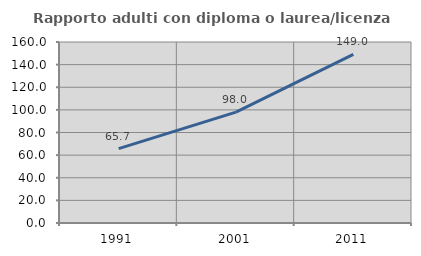
| Category | Rapporto adulti con diploma o laurea/licenza media  |
|---|---|
| 1991.0 | 65.743 |
| 2001.0 | 97.978 |
| 2011.0 | 148.986 |